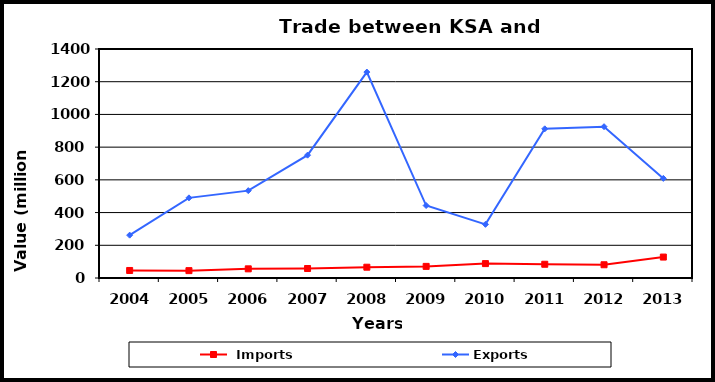
| Category |  Imports | Exports |
|---|---|---|
| 2004.0 | 46 | 262 |
| 2005.0 | 45 | 490 |
| 2006.0 | 56 | 534 |
| 2007.0 | 58 | 751 |
| 2008.0 | 66 | 1259 |
| 2009.0 | 71 | 443 |
| 2010.0 | 88 | 328 |
| 2011.0 | 84 | 912 |
| 2012.0 | 81 | 925 |
| 2013.0 | 128 | 609 |